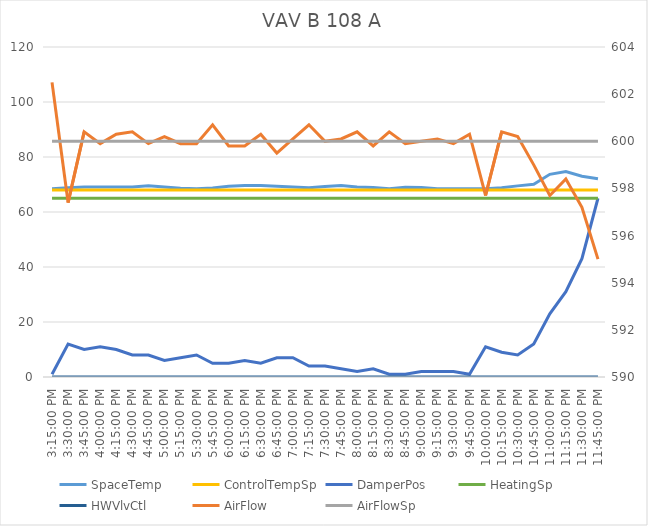
| Category | SpaceTemp | ControlTempSp | DamperPos | HeatingSp | HWVlvCtl |
|---|---|---|---|---|---|
| 2019-09-07 15:15:00 | 68.5 | 68 | 1 | 65 | 0 |
| 2019-09-07 15:30:00 | 68.8 | 68 | 12 | 65 | 0 |
| 2019-09-07 15:45:00 | 69.1 | 68 | 10 | 65 | 0 |
| 2019-09-07 16:00:00 | 69.1 | 68 | 11 | 65 | 0 |
| 2019-09-07 16:15:00 | 69.1 | 68 | 10 | 65 | 0 |
| 2019-09-07 16:30:00 | 69.1 | 68 | 8 | 65 | 0 |
| 2019-09-07 16:45:00 | 69.5 | 68 | 8 | 65 | 0 |
| 2019-09-07 17:00:00 | 69.1 | 68 | 6 | 65 | 0 |
| 2019-09-07 17:15:00 | 68.6 | 68 | 7 | 65 | 0 |
| 2019-09-07 17:30:00 | 68.5 | 68 | 8 | 65 | 0 |
| 2019-09-07 17:45:00 | 68.7 | 68 | 5 | 65 | 0 |
| 2019-09-07 18:00:00 | 69.4 | 68 | 5 | 65 | 0 |
| 2019-09-07 18:15:00 | 69.6 | 68 | 6 | 65 | 0 |
| 2019-09-07 18:30:00 | 69.6 | 68 | 5 | 65 | 0 |
| 2019-09-07 18:45:00 | 69.4 | 68 | 7 | 65 | 0 |
| 2019-09-07 19:00:00 | 69.1 | 68 | 7 | 65 | 0 |
| 2019-09-07 19:15:00 | 68.8 | 68 | 4 | 65 | 0 |
| 2019-09-07 19:30:00 | 69.3 | 68 | 4 | 65 | 0 |
| 2019-09-07 19:45:00 | 69.6 | 68 | 3 | 65 | 0 |
| 2019-09-07 20:00:00 | 69.1 | 68 | 2 | 65 | 0 |
| 2019-09-07 20:15:00 | 68.9 | 68 | 3 | 65 | 0 |
| 2019-09-07 20:30:00 | 68.5 | 68 | 1 | 65 | 0 |
| 2019-09-07 20:45:00 | 69 | 68 | 1 | 65 | 0 |
| 2019-09-07 21:00:00 | 68.9 | 68 | 2 | 65 | 0 |
| 2019-09-07 21:15:00 | 68.5 | 68 | 2 | 65 | 0 |
| 2019-09-07 21:30:00 | 68.5 | 68 | 2 | 65 | 0 |
| 2019-09-07 21:45:00 | 68.5 | 68 | 1 | 65 | 0 |
| 2019-09-07 22:00:00 | 68.5 | 68 | 11 | 65 | 0 |
| 2019-09-07 22:15:00 | 68.8 | 68 | 9 | 65 | 0 |
| 2019-09-07 22:30:00 | 69.5 | 68 | 8 | 65 | 0 |
| 2019-09-07 22:45:00 | 70.1 | 68 | 12 | 65 | 0 |
| 2019-09-07 23:00:00 | 73.7 | 68 | 23 | 65 | 0 |
| 2019-09-07 23:15:00 | 74.7 | 68 | 31 | 65 | 0 |
| 2019-09-07 23:30:00 | 73 | 68 | 43 | 65 | 0 |
| 2019-09-07 23:45:00 | 72.1 | 68 | 65 | 65 | 0 |